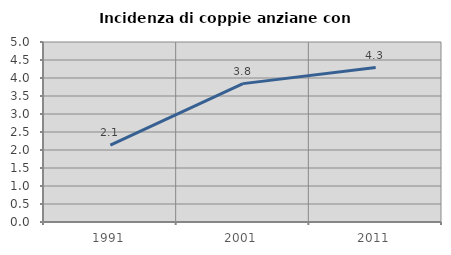
| Category | Incidenza di coppie anziane con figli |
|---|---|
| 1991.0 | 2.137 |
| 2001.0 | 3.844 |
| 2011.0 | 4.29 |